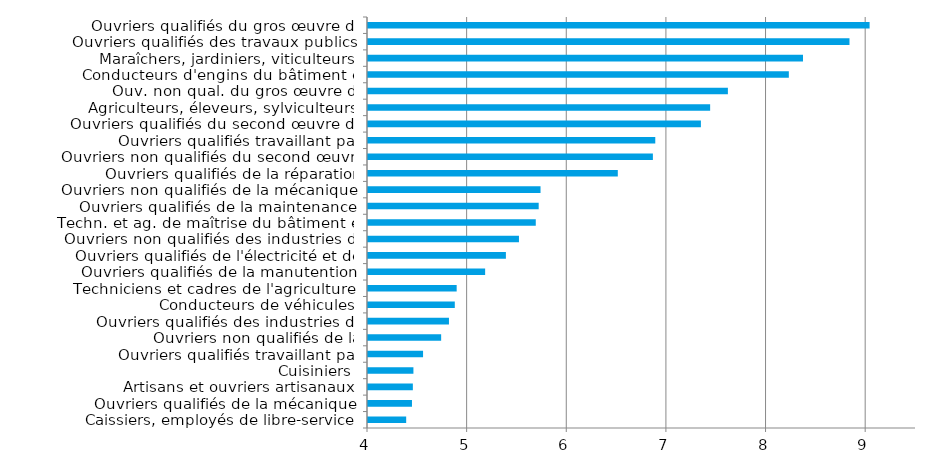
| Category | Series 0 |
|---|---|
| Caissiers, employés de libre-service | 4.383 |
| Ouvriers qualifiés de la mécanique | 4.441 |
| Artisans et ouvriers artisanaux | 4.45 |
| Cuisiniers | 4.456 |
| Ouvriers qualifiés travaillant par enlèvement de métal | 4.553 |
| Ouvriers non qualifiés de la manutention | 4.734 |
| Ouvriers qualifiés des industries de process | 4.813 |
| Conducteurs de véhicules | 4.871 |
| Techniciens et cadres de l'agriculture | 4.89 |
| Ouvriers qualifiés de la manutention | 5.176 |
| Ouvriers qualifiés de l'électricité et de l'électronique | 5.384 |
| Ouvriers non qualifiés des industries de process | 5.515 |
| Techn. et ag. de maîtrise du bâtiment et des tr. publics | 5.684 |
| Ouvriers qualifiés de la maintenance | 5.713 |
| Ouvriers non qualifiés de la mécanique | 5.732 |
| Ouvriers qualifiés de la réparation automobile | 6.507 |
| Ouvriers non qualifiés du second œuvre du bâtiment | 6.859 |
| Ouvriers qualifiés travaillant par formage de métal | 6.883 |
| Ouvriers qualifiés du second œuvre du bâtiment | 7.341 |
| Agriculteurs, éleveurs, sylviculteurs, bûcherons | 7.434 |
| Ouv. non qual. du gros œuvre du bâtiment et trav. publics | 7.612 |
| Conducteurs d'engins du bâtiment et des travaux publics | 8.224 |
| Maraîchers, jardiniers, viticulteurs | 8.366 |
| Ouvriers qualifiés des travaux publics | 8.832 |
| Ouvriers qualifiés du gros œuvre du bâtiment | 9.034 |